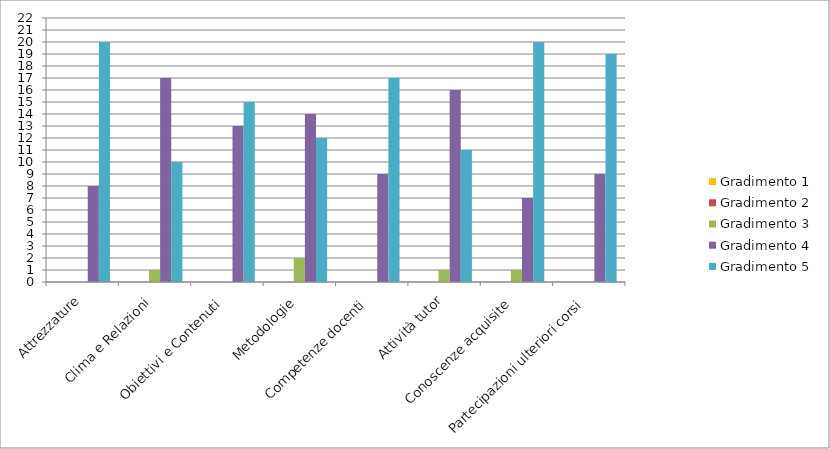
| Category | Gradimento 1 | Gradimento 2 | Gradimento 3 | Gradimento 4 | Gradimento 5 |
|---|---|---|---|---|---|
| Attrezzature | 0 | 0 | 0 | 8 | 20 |
| Clima e Relazioni  | 0 | 0 | 1 | 17 | 10 |
| Obiettivi e Contenuti | 0 | 0 | 0 | 13 | 15 |
| Metodologie | 0 | 0 | 2 | 14 | 12 |
| Competenze docenti | 0 | 0 | 0 | 9 | 17 |
| Attività tutor | 0 | 0 | 1 | 16 | 11 |
| Conoscenze acquisite | 0 | 0 | 1 | 7 | 20 |
| Partecipazioni ulteriori corsi | 0 | 0 | 0 | 9 | 19 |